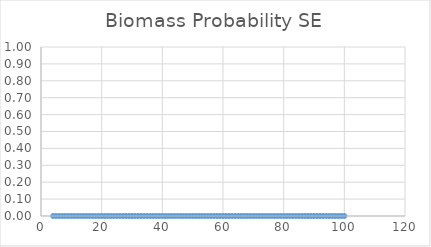
| Category | Probability SE |
|---|---|
| 4.0 | 0 |
| 5.0 | 0 |
| 6.0 | 0 |
| 7.0 | 0 |
| 8.0 | 0 |
| 9.0 | 0 |
| 10.0 | 0 |
| 11.0 | 0 |
| 12.0 | 0 |
| 13.0 | 0 |
| 14.0 | 0 |
| 15.0 | 0 |
| 16.0 | 0 |
| 17.0 | 0 |
| 18.0 | 0 |
| 19.0 | 0 |
| 20.0 | 0 |
| 21.0 | 0 |
| 22.0 | 0 |
| 23.0 | 0 |
| 24.0 | 0 |
| 25.0 | 0 |
| 26.0 | 0 |
| 27.0 | 0 |
| 28.0 | 0 |
| 29.0 | 0 |
| 30.0 | 0 |
| 31.0 | 0 |
| 32.0 | 0 |
| 33.0 | 0 |
| 34.0 | 0 |
| 35.0 | 0 |
| 36.0 | 0 |
| 37.0 | 0 |
| 38.0 | 0 |
| 39.0 | 0 |
| 40.0 | 0 |
| 41.0 | 0 |
| 42.0 | 0 |
| 43.0 | 0 |
| 44.0 | 0 |
| 45.0 | 0 |
| 46.0 | 0 |
| 47.0 | 0 |
| 48.0 | 0 |
| 49.0 | 0 |
| 50.0 | 0 |
| 51.0 | 0 |
| 52.0 | 0 |
| 53.0 | 0 |
| 54.0 | 0 |
| 55.0 | 0 |
| 56.0 | 0 |
| 57.0 | 0 |
| 58.0 | 0 |
| 59.0 | 0 |
| 60.0 | 0 |
| 61.0 | 0 |
| 62.0 | 0 |
| 63.0 | 0 |
| 64.0 | 0 |
| 65.0 | 0 |
| 66.0 | 0 |
| 67.0 | 0 |
| 68.0 | 0 |
| 69.0 | 0 |
| 70.0 | 0 |
| 71.0 | 0 |
| 72.0 | 0 |
| 73.0 | 0 |
| 74.0 | 0 |
| 75.0 | 0 |
| 76.0 | 0 |
| 77.0 | 0 |
| 78.0 | 0 |
| 79.0 | 0 |
| 80.0 | 0 |
| 81.0 | 0 |
| 82.0 | 0 |
| 83.0 | 0 |
| 84.0 | 0 |
| 85.0 | 0 |
| 86.0 | 0 |
| 87.0 | 0 |
| 88.0 | 0 |
| 89.0 | 0 |
| 90.0 | 0 |
| 91.0 | 0 |
| 92.0 | 0 |
| 93.0 | 0 |
| 94.0 | 0 |
| 95.0 | 0 |
| 96.0 | 0 |
| 97.0 | 0 |
| 98.0 | 0 |
| 99.0 | 0 |
| 100.0 | 0 |